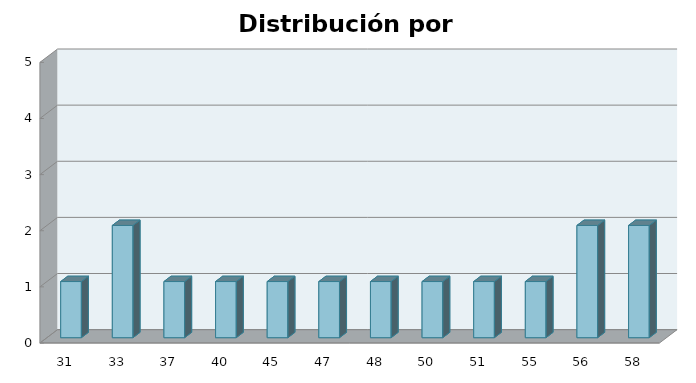
| Category | Series 1 |
|---|---|
| 31.0 | 1 |
| 33.0 | 2 |
| 37.0 | 1 |
| 40.0 | 1 |
| 45.0 | 1 |
| 47.0 | 1 |
| 48.0 | 1 |
| 50.0 | 1 |
| 51.0 | 1 |
| 55.0 | 1 |
| 56.0 | 2 |
| 58.0 | 2 |